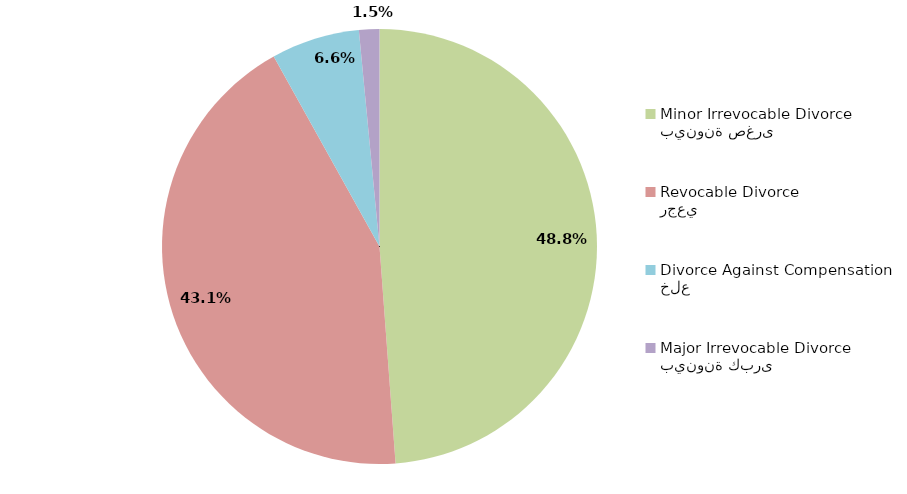
| Category | Series 1 |
|---|---|
| بينونة صغرى
Minor Irrevocable Divorce  | 48.822 |
| رجعي
Revocable Divorce  | 43.098 |
| خلع
Divorce Against Compensation | 6.566 |
| بينونة كبرى
Major Irrevocable Divorce  | 1.515 |